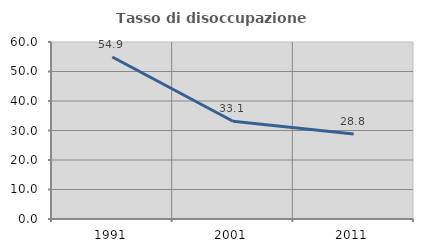
| Category | Tasso di disoccupazione giovanile  |
|---|---|
| 1991.0 | 54.931 |
| 2001.0 | 33.148 |
| 2011.0 | 28.785 |